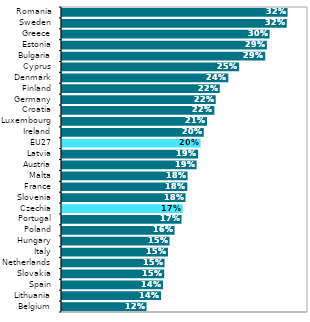
| Category | Series 0 |
|---|---|
| Belgium | 0.12 |
| Lithuania | 0.141 |
| Spain | 0.144 |
| Slovakia | 0.145 |
| Netherlands | 0.146 |
| Italy | 0.151 |
| Hungary | 0.153 |
| Poland | 0.16 |
| Portugal | 0.17 |
| Czechia | 0.172 |
| Slovenia | 0.176 |
| France | 0.178 |
| Malta | 0.179 |
| Austria | 0.192 |
| Latvia | 0.194 |
| EU27 | 0.197 |
| Ireland | 0.202 |
| Luxembourg | 0.206 |
| Croatia | 0.217 |
| Germany | 0.219 |
| Finland | 0.224 |
| Denmark | 0.237 |
| Cyprus | 0.252 |
| Bulgaria | 0.289 |
| Estonia | 0.292 |
| Greece | 0.295 |
| Sweden | 0.32 |
| Romania | 0.321 |